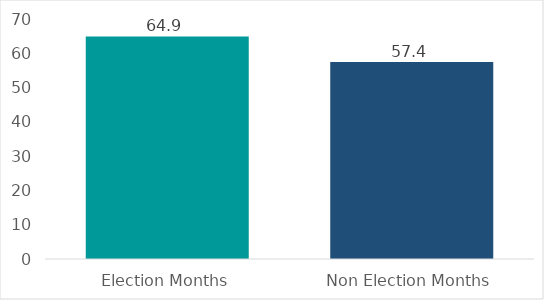
| Category | Average Amont per Month |
|---|---|
| Election Months | 64.91 |
| Non Election Months | 57.422 |